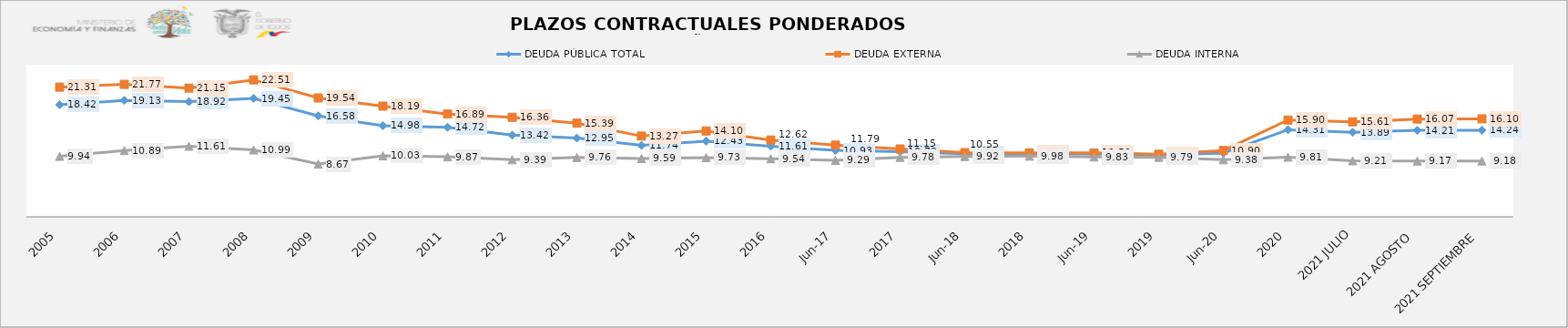
| Category | DEUDA PÚBLICA TOTAL | DEUDA EXTERNA  | DEUDA INTERNA |
|---|---|---|---|
| 2005 | 18.42 | 21.31 | 9.94 |
| 2006 | 19.13 | 21.77 | 10.89 |
| 2007 | 18.92 | 21.15 | 11.61 |
| 2008 | 19.45 | 22.505 | 10.99 |
| 2009 | 16.58 | 19.536 | 8.67 |
| 2010 | 14.98 | 18.188 | 10.03 |
| 2011 | 14.717 | 16.89 | 9.87 |
| 2012 | 13.423 | 16.356 | 9.39 |
| 2013 | 12.946 | 15.393 | 9.76 |
| 2014 | 11.737 | 13.27 | 9.59 |
| 2015 | 12.43 | 14.105 | 9.734 |
| 2016 | 11.611 | 12.616 | 9.541 |
| jun-17 | 10.928 | 11.786 | 9.294 |
| 2017 | 10.717 | 11.155 | 9.776 |
| jun-18 | 10.364 | 10.547 | 9.919 |
| 2018 | 10.371 | 10.522 | 9.976 |
| jun-19 | 10.321 | 10.498 | 9.835 |
| 2019 | 10.156 | 10.284 | 9.786 |
| jun-20 | 10.488 | 10.898 | 9.379 |
| 2020 | 14.309 | 15.905 | 9.812 |
| 2021 JULIO | 13.89 | 15.614 | 9.21 |
| 2021 AGOSTO | 14.21 | 16.07 | 9.17 |
| 2021 SEPTIEMBRE | 14.24 | 16.1 | 9.18 |